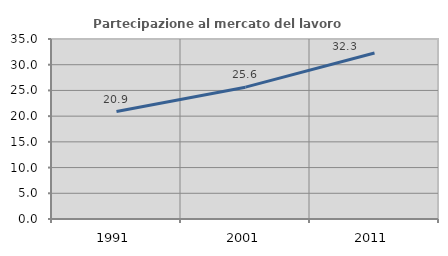
| Category | Partecipazione al mercato del lavoro  femminile |
|---|---|
| 1991.0 | 20.902 |
| 2001.0 | 25.634 |
| 2011.0 | 32.275 |